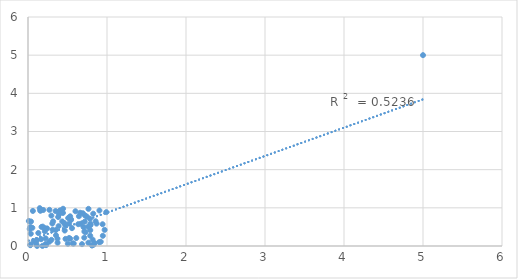
| Category | set 2 |
|---|---|
| 5.0 | 5 |
| 0.05493442352852018 | 0.476 |
| 0.3875870023303096 | 0.52 |
| 0.035065217034446095 | 0.321 |
| 0.8422212276855504 | 0.076 |
| 0.600791707313468 | 0.911 |
| 0.35391863471269613 | 0.282 |
| 0.47251185487270775 | 0.538 |
| 0.5676723665308354 | 0.065 |
| 0.8180002118568788 | 0.168 |
| 0.7880493557581669 | 0.416 |
| 0.34955118204708513 | 0.916 |
| 0.44385010574368056 | 0.975 |
| 0.4332365711731505 | 0.643 |
| 0.8302167691973696 | 0.033 |
| 0.9009940001392028 | 0.101 |
| 0.5195430896184136 | 0.208 |
| 0.4749666003147699 | 0.186 |
| 0.37295124477146746 | 0.191 |
| 0.028656570580927854 | 0.021 |
| 0.7444408372502771 | 0.77 |
| 0.10365654780165512 | 0.063 |
| 0.11473212626388662 | 0.002 |
| 0.39338689863965803 | 0.833 |
| 0.5336317225429447 | 0.778 |
| 0.4647382622511297 | 0.405 |
| 0.29601719488083067 | 0.796 |
| 0.694332084548909 | 0.858 |
| 0.7655070111134125 | 0.973 |
| 0.4425029895249759 | 0.866 |
| 0.4591129235871947 | 0.601 |
| 0.20803276571865725 | 0.469 |
| 0.021523733322409644 | 0.447 |
| 0.6112227064405313 | 0.208 |
| 0.7135634183570119 | 0.38 |
| 0.22843741821504926 | 0.022 |
| 0.010510106977936085 | 0.654 |
| 0.15969863114330707 | 0.936 |
| 0.71762691341827 | 0.638 |
| 0.17153628677540123 | 0.499 |
| 0.9041643480143592 | 0.93 |
| 0.7640935862698807 | 0.087 |
| 0.7844174959106879 | 0.714 |
| 0.7028389925308166 | 0.496 |
| 0.11321325703780205 | 0.152 |
| 0.07262145629793937 | 0.129 |
| 0.7905123680100256 | 0.586 |
| 0.24093891160212677 | 0.461 |
| 0.22373649901304582 | 0.199 |
| 0.7872070208981701 | 0.27 |
| 0.7223486186095319 | 0.799 |
| 0.6687075410126548 | 0.582 |
| 0.037939959938231294 | 0.642 |
| 0.2716267795265962 | 0.947 |
| 0.18314032019337045 | 0.003 |
| 0.6602092157383551 | 0.871 |
| 0.6355111953097894 | 0.571 |
| 0.029360271369000546 | 0.497 |
| 0.990927042523492 | 0.888 |
| 0.2710992898743767 | 0.112 |
| 0.31041982466917906 | 0.425 |
| 0.14884774197781492 | 0.992 |
| 0.5445633114945613 | 0.685 |
| 0.7280281882120713 | 0.362 |
| 0.9440550905783566 | 0.57 |
| 0.8557305684470179 | 0.649 |
| 0.18702460478407879 | 0.507 |
| 0.31793656864020703 | 0.646 |
| 0.29652881549155496 | 0.161 |
| 0.5566928199811025 | 0.467 |
| 0.5089816330248902 | 0.733 |
| 0.22334844030981582 | 0.051 |
| 0.6836087110481878 | 0.049 |
| 0.3080703415549759 | 0.589 |
| 0.8255381177951452 | 0.846 |
| 0.0315238744509968 | 0.036 |
| 0.9208524945620229 | 0.111 |
| 0.6441857316972216 | 0.78 |
| 0.3820182762532317 | 0.759 |
| 0.5203463331760196 | 0.586 |
| 0.5338899490319092 | 0.19 |
| 0.3526069413252988 | 0.419 |
| 0.3744990418267917 | 0.086 |
| 0.15510210578952532 | 0.924 |
| 0.504430302685906 | 0.059 |
| 0.9473574250555136 | 0.267 |
| 0.1659650042272499 | 0.179 |
| 0.19330331005284784 | 0.944 |
| 0.13057776543647814 | 0.34 |
| 0.06171888009380444 | 0.919 |
| 0.8678434553135814 | 0.586 |
| 0.7614583688190251 | 0.506 |
| 0.212711243451702 | 0.386 |
| 0.5788252385826499 | 0.065 |
| 0.7122449283559756 | 0.218 |
| 0.5414568005754478 | 0.706 |
| 0.7918313953107117 | 0.548 |
| 0.9699548741784264 | 0.423 |
| 0.8099251877193161 | 0.012 |
| 0.4045279080742793 | 0.932 |